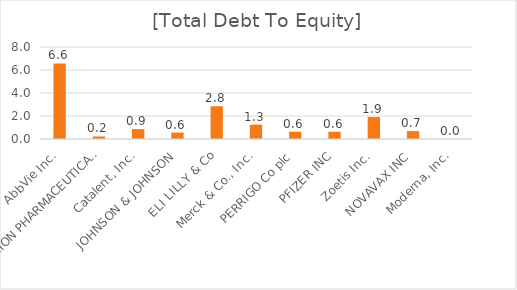
| Category | [Total Debt To Equity] |
|---|---|
| AbbVie Inc. | 6.571 |
| ALEXION PHARMACEUTICALS, INC. | 0.22 |
| Catalent, Inc. | 0.861 |
| JOHNSON & JOHNSON | 0.557 |
| ELI LILLY & Co | 2.849 |
| Merck & Co., Inc. | 1.251 |
| PERRIGO Co plc | 0.631 |
| PFIZER INC | 0.628 |
| Zoetis Inc. | 1.908 |
| NOVAVAX INC | 0.682 |
| Moderna, Inc. | 0 |